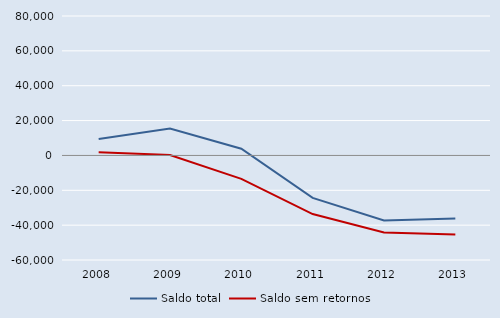
| Category | Saldo total | Saldo sem retornos |
|---|---|---|
| 2008.0 | 9361 | 1760 |
| 2009.0 | 15408 | 286 |
| 2010.0 | 3815 | -13443 |
| 2011.0 | -24331 | -33648 |
| 2012.0 | -37352 | -44186 |
| 2013.0 | -36232 | -45437 |